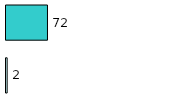
| Category | Series 0 | Series 1 |
|---|---|---|
| 0 | 2 | 72 |